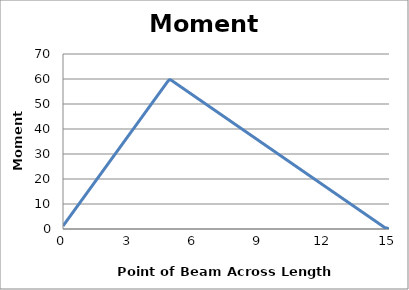
| Category | Moment
(kN*m) |
|---|---|
| 0.0 | 1.2 |
| 0.1 | 2.4 |
| 0.2 | 3.6 |
| 0.3 | 4.8 |
| 0.4 | 6 |
| 0.5 | 7.2 |
| 0.6 | 8.4 |
| 0.7 | 9.6 |
| 0.8 | 10.8 |
| 0.9 | 12 |
| 1.0 | 13.2 |
| 1.1 | 14.4 |
| 1.2 | 15.6 |
| 1.3 | 16.8 |
| 1.4 | 18 |
| 1.5 | 19.2 |
| 1.6 | 20.4 |
| 1.7 | 21.6 |
| 1.8 | 22.8 |
| 1.9 | 24 |
| 2.0 | 25.2 |
| 2.1 | 26.4 |
| 2.2 | 27.6 |
| 2.3 | 28.8 |
| 2.4 | 30 |
| 2.5 | 31.2 |
| 2.6 | 32.4 |
| 2.7 | 33.6 |
| 2.8 | 34.8 |
| 2.9 | 36 |
| 3.0 | 37.2 |
| 3.1 | 38.4 |
| 3.2 | 39.6 |
| 3.3 | 40.8 |
| 3.4 | 42 |
| 3.5 | 43.2 |
| 3.6 | 44.4 |
| 3.7 | 45.6 |
| 3.8 | 46.8 |
| 3.9 | 48 |
| 4.0 | 49.2 |
| 4.1 | 50.4 |
| 4.2 | 51.6 |
| 4.3 | 52.8 |
| 4.4 | 54 |
| 4.5 | 55.2 |
| 4.6 | 56.4 |
| 4.7 | 57.6 |
| 4.8 | 58.8 |
| 4.9 | 59.7 |
| 5.0 | 59.4 |
| 5.1 | 58.8 |
| 5.2 | 58.2 |
| 5.3 | 57.6 |
| 5.4 | 57 |
| 5.5 | 56.4 |
| 5.6 | 55.8 |
| 5.7 | 55.2 |
| 5.8 | 54.6 |
| 5.9 | 54 |
| 6.0 | 53.4 |
| 6.1 | 52.8 |
| 6.2 | 52.2 |
| 6.3 | 51.6 |
| 6.4 | 51 |
| 6.5 | 50.4 |
| 6.6 | 49.8 |
| 6.7 | 49.2 |
| 6.8 | 48.6 |
| 6.9 | 48 |
| 7.0 | 47.4 |
| 7.1 | 46.8 |
| 7.2 | 46.2 |
| 7.3 | 45.6 |
| 7.4 | 45 |
| 7.5 | 44.4 |
| 7.6 | 43.8 |
| 7.7 | 43.2 |
| 7.8 | 42.6 |
| 7.9 | 42 |
| 8.0 | 41.4 |
| 8.1 | 40.8 |
| 8.2 | 40.2 |
| 8.3 | 39.6 |
| 8.4 | 39 |
| 8.5 | 38.4 |
| 8.6 | 37.8 |
| 8.7 | 37.2 |
| 8.8 | 36.6 |
| 8.9 | 36 |
| 9.0 | 35.4 |
| 9.1 | 34.8 |
| 9.2 | 34.2 |
| 9.3 | 33.6 |
| 9.4 | 33 |
| 9.5 | 32.4 |
| 9.6 | 31.8 |
| 9.7 | 31.2 |
| 9.8 | 30.6 |
| 9.9 | 30 |
| 10.0 | 29.4 |
| 10.1 | 28.8 |
| 10.2 | 28.2 |
| 10.3 | 27.6 |
| 10.4 | 27 |
| 10.5 | 26.4 |
| 10.6 | 25.8 |
| 10.7 | 25.2 |
| 10.8 | 24.6 |
| 10.9 | 24 |
| 11.0 | 23.4 |
| 11.1 | 22.8 |
| 11.2 | 22.2 |
| 11.3 | 21.6 |
| 11.4 | 21 |
| 11.5 | 20.4 |
| 11.6 | 19.8 |
| 11.7 | 19.2 |
| 11.8 | 18.6 |
| 11.9 | 18 |
| 12.0 | 17.4 |
| 12.1 | 16.8 |
| 12.2 | 16.2 |
| 12.3 | 15.6 |
| 12.4 | 15 |
| 12.5 | 14.4 |
| 12.6 | 13.8 |
| 12.7 | 13.2 |
| 12.8 | 12.6 |
| 12.9 | 12 |
| 13.0 | 11.4 |
| 13.1 | 10.8 |
| 13.2 | 10.2 |
| 13.3 | 9.6 |
| 13.4 | 9 |
| 13.5 | 8.4 |
| 13.6 | 7.8 |
| 13.7 | 7.2 |
| 13.8 | 6.6 |
| 13.9 | 6 |
| 14.0 | 5.4 |
| 14.1 | 4.8 |
| 14.2 | 4.2 |
| 14.3 | 3.6 |
| 14.4 | 3 |
| 14.5 | 2.4 |
| 14.6 | 1.8 |
| 14.7 | 1.2 |
| 14.8 | 0.6 |
| 14.9 | 0.39 |
| 15.0 | 0 |